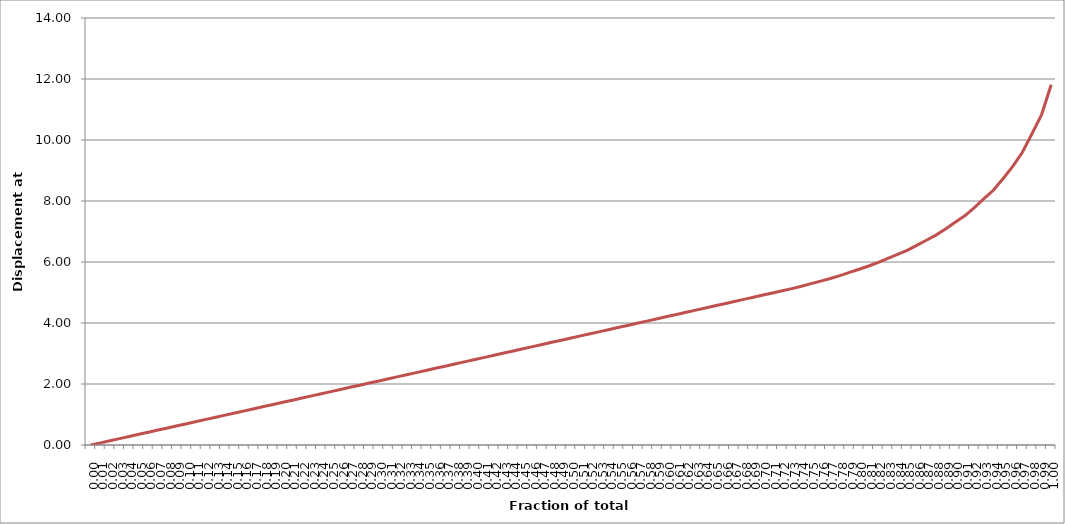
| Category | Displacement at mid-span [mm] |
|---|---|
| 0.0 | 0 |
| 0.01 | 0.07 |
| 0.02 | 0.14 |
| 0.03 | 0.21 |
| 0.04 | 0.28 |
| 0.05 | 0.35 |
| 0.06 | 0.42 |
| 0.06999999999999999 | 0.49 |
| 0.08 | 0.559 |
| 0.09 | 0.629 |
| 0.1 | 0.699 |
| 0.11000000000000001 | 0.769 |
| 0.12 | 0.839 |
| 0.13 | 0.909 |
| 0.13999999999999999 | 0.98 |
| 0.15 | 1.05 |
| 0.16 | 1.12 |
| 0.16999999999999998 | 1.19 |
| 0.18 | 1.26 |
| 0.19 | 1.33 |
| 0.2 | 1.4 |
| 0.21000000000000002 | 1.47 |
| 0.22000000000000003 | 1.54 |
| 0.22999999999999998 | 1.61 |
| 0.24 | 1.68 |
| 0.25 | 1.75 |
| 0.26 | 1.821 |
| 0.27 | 1.891 |
| 0.27999999999999997 | 1.961 |
| 0.29 | 2.031 |
| 0.3 | 2.101 |
| 0.31 | 2.171 |
| 0.32 | 2.242 |
| 0.32999999999999996 | 2.312 |
| 0.33999999999999997 | 2.382 |
| 0.35 | 2.452 |
| 0.36 | 2.522 |
| 0.37 | 2.593 |
| 0.38 | 2.663 |
| 0.39 | 2.733 |
| 0.4 | 2.804 |
| 0.41 | 2.874 |
| 0.42000000000000004 | 2.944 |
| 0.43 | 3.014 |
| 0.44000000000000006 | 3.085 |
| 0.45 | 3.155 |
| 0.45999999999999996 | 3.225 |
| 0.47000000000000003 | 3.296 |
| 0.48 | 3.366 |
| 0.49000000000000005 | 3.436 |
| 0.5 | 3.507 |
| 0.51 | 3.577 |
| 0.52 | 3.647 |
| 0.53 | 3.718 |
| 0.54 | 3.788 |
| 0.55 | 3.859 |
| 0.5599999999999999 | 3.929 |
| 0.5700000000000001 | 3.999 |
| 0.58 | 4.07 |
| 0.5900000000000001 | 4.14 |
| 0.6 | 4.211 |
| 0.61 | 4.281 |
| 0.62 | 4.352 |
| 0.63 | 4.422 |
| 0.64 | 4.493 |
| 0.65 | 4.563 |
| 0.6599999999999999 | 4.634 |
| 0.67 | 4.704 |
| 0.6799999999999999 | 4.775 |
| 0.6900000000000001 | 4.845 |
| 0.7 | 4.916 |
| 0.71 | 4.986 |
| 0.72 | 5.057 |
| 0.73 | 5.127 |
| 0.74 | 5.205 |
| 0.75 | 5.29 |
| 0.76 | 5.374 |
| 0.77 | 5.459 |
| 0.78 | 5.554 |
| 0.79 | 5.659 |
| 0.8 | 5.763 |
| 0.8099999999999999 | 5.868 |
| 0.82 | 5.988 |
| 0.8300000000000001 | 6.118 |
| 0.8400000000000001 | 6.248 |
| 0.85 | 6.381 |
| 0.86 | 6.548 |
| 0.8699999999999999 | 6.715 |
| 0.8800000000000001 | 6.882 |
| 0.89 | 7.084 |
| 0.9 | 7.3 |
| 0.9099999999999999 | 7.515 |
| 0.9199999999999999 | 7.785 |
| 0.93 | 8.078 |
| 0.9400000000000001 | 8.36 |
| 0.95 | 8.74 |
| 0.96 | 9.134 |
| 0.97 | 9.597 |
| 0.9800000000000001 | 10.206 |
| 0.99 | 10.834 |
| 1.0 | 11.814 |